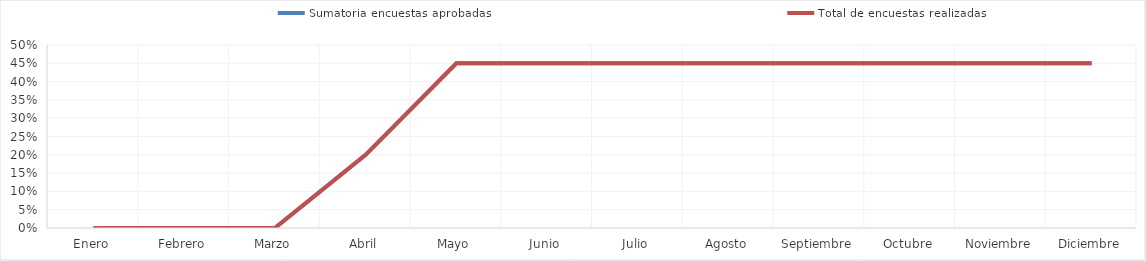
| Category | Sumatoria encuestas aprobadas | Total de encuestas realizadas |
|---|---|---|
| 0 | 0 | 0 |
| 1 | 0 | 0 |
| 2 | 0 | 0 |
| 3 | 0.2 | 0.2 |
| 4 | 0.45 | 0.45 |
| 5 | 0.45 | 0.45 |
| 6 | 0.45 | 0.45 |
| 7 | 0.45 | 0.45 |
| 8 | 0.45 | 0.45 |
| 9 | 0.45 | 0.45 |
| 10 | 0.45 | 0.45 |
| 11 | 0.45 | 0.45 |